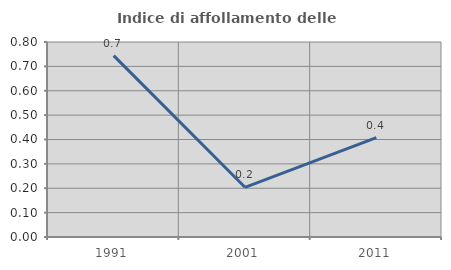
| Category | Indice di affollamento delle abitazioni  |
|---|---|
| 1991.0 | 0.744 |
| 2001.0 | 0.204 |
| 2011.0 | 0.408 |